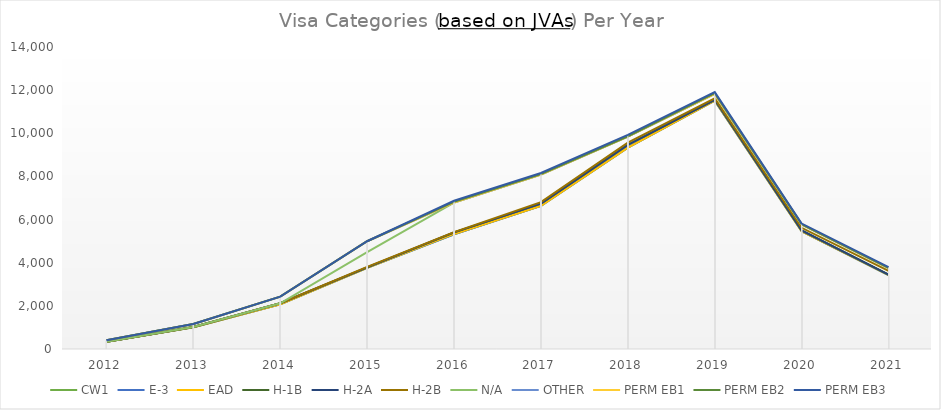
| Category | CW1 | E-3 | EAD | H-1B | H-2A | H-2B | N/A | OTHER | PERM EB1 | PERM EB2 | PERM EB3 |
|---|---|---|---|---|---|---|---|---|---|---|---|
| 2012.0 | 337 | 0 | 0 | 1 | 0 | 2 | 0 | 62 | 0 | 0 | 0 |
| 2013.0 | 1011 | 0 | 0 | 7 | 0 | 6 | 0 | 135 | 0 | 0 | 0 |
| 2014.0 | 2077 | 0 | 0 | 42 | 0 | 1 | 0 | 305 | 0 | 0 | 0 |
| 2015.0 | 3759 | 0 | 2 | 24 | 0 | 20 | 689 | 501 | 0 | 0 | 0 |
| 2016.0 | 5322 | 0 | 12 | 74 | 0 | 12 | 1369 | 0 | 0 | 33 | 50 |
| 2017.0 | 6636 | 0 | 3 | 99 | 1 | 72 | 1274 | 0 | 0 | 23 | 53 |
| 2018.0 | 9332 | 0 | 4 | 125 | 1 | 106 | 273 | 0 | 0 | 19 | 70 |
| 2019.0 | 11514 | 0 | 5 | 35 | 0 | 66 | 205 | 0 | 1 | 37 | 45 |
| 2020.0 | 5464 | 0 | 0 | 32 | 0 | 122 | 152 | 6 | 0 | 8 | 32 |
| 2021.0 | 3429 | 2 | 2 | 19 | 0 | 170 | 127 | 0 | 2 | 12 | 37 |